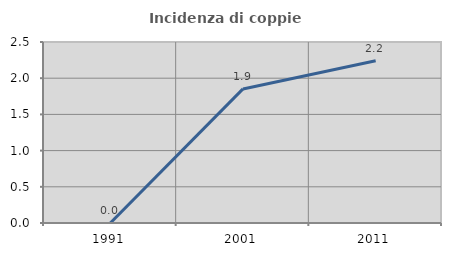
| Category | Incidenza di coppie miste |
|---|---|
| 1991.0 | 0 |
| 2001.0 | 1.852 |
| 2011.0 | 2.242 |